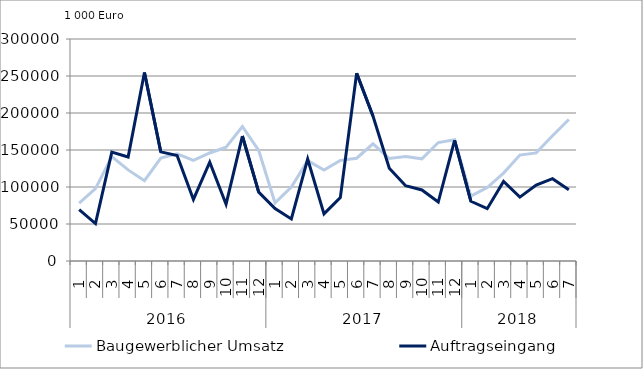
| Category | Baugewerblicher Umsatz | Auftragseingang |
|---|---|---|
| 0 | 78291.738 | 69470.357 |
| 1 | 97863.379 | 50640.033 |
| 2 | 141176.119 | 147206.65 |
| 3 | 123121.297 | 140579.009 |
| 4 | 108561.124 | 254739.334 |
| 5 | 139030.209 | 147481.644 |
| 6 | 144784.416 | 142609.658 |
| 7 | 135870.195 | 83192.156 |
| 8 | 145961.738 | 133594.351 |
| 9 | 153886.826 | 76793.838 |
| 10 | 181740.037 | 168867.568 |
| 11 | 149348.138 | 93011.853 |
| 12 | 78446.78 | 70908.903 |
| 13 | 99841.908 | 56868.408 |
| 14 | 135679.867 | 137790.423 |
| 15 | 123004.403 | 63637.761 |
| 16 | 136010.071 | 85644.63 |
| 17 | 138859.308 | 253791.552 |
| 18 | 158353.879 | 196034.198 |
| 19 | 138510.315 | 125319.873 |
| 20 | 141109.925 | 101690.626 |
| 21 | 138067.098 | 95966.626 |
| 22 | 160064.454 | 79701.993 |
| 23 | 163969.017 | 162878.607 |
| 24 | 87640.529 | 80684.627 |
| 25 | 99259.455 | 70746.763 |
| 26 | 118764.324 | 107538.747 |
| 27 | 143144.178 | 86374.619 |
| 28 | 146070.782 | 102661.329 |
| 29 | 169150.753 | 111287.709 |
| 30 | 191277.885 | 96286.662 |